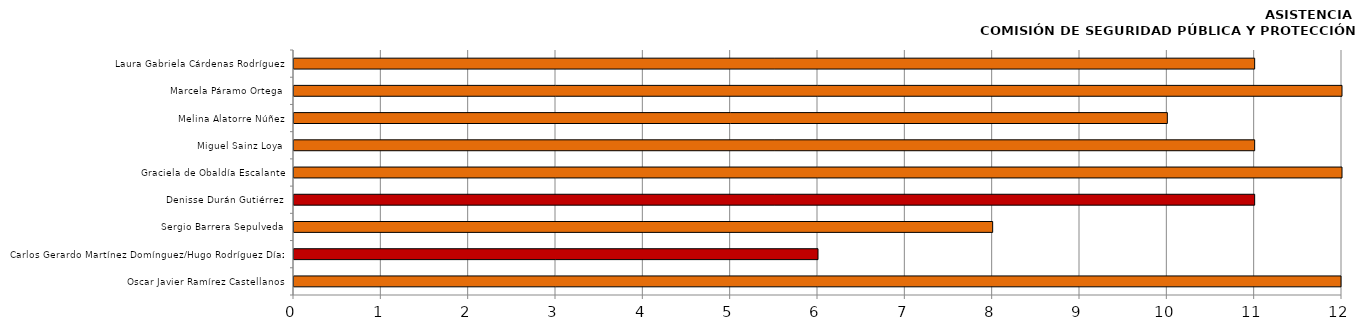
| Category | Series 0 |
|---|---|
| Oscar Javier Ramírez Castellanos | 13 |
| Carlos Gerardo Martínez Domínguez/Hugo Rodríguez Díaz | 6 |
| Sergio Barrera Sepulveda | 8 |
| Denisse Durán Gutiérrez | 11 |
| Graciela de Obaldía Escalante | 12 |
| Miguel Sainz Loya | 11 |
| Melina Alatorre Núñez | 10 |
| Marcela Páramo Ortega | 12 |
| Laura Gabriela Cárdenas Rodríguez | 11 |